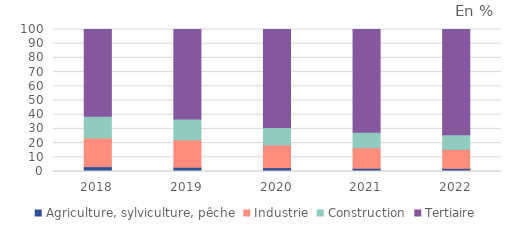
| Category | Agriculture, sylviculture, pêche | Industrie | Construction | Tertiaire |
|---|---|---|---|---|
| 2018.0 | 3.4 | 20.2 | 15.3 | 61.1 |
| 2019.0 | 3 | 19.2 | 14.8 | 63 |
| 2020.0 | 2.7 | 15.9 | 12.3 | 69.1 |
| 2021.0 | 2.3 | 14.4 | 10.9 | 72.4 |
| 2022.0 | 2.2 | 13.4 | 10.2 | 74.3 |